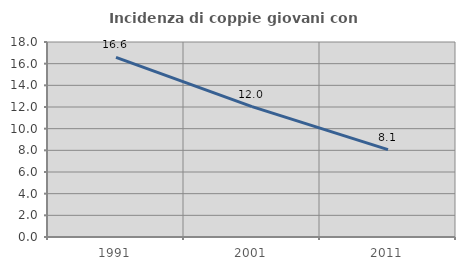
| Category | Incidenza di coppie giovani con figli |
|---|---|
| 1991.0 | 16.583 |
| 2001.0 | 12.03 |
| 2011.0 | 8.068 |